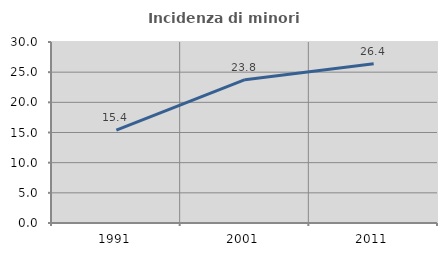
| Category | Incidenza di minori stranieri |
|---|---|
| 1991.0 | 15.385 |
| 2001.0 | 23.75 |
| 2011.0 | 26.396 |